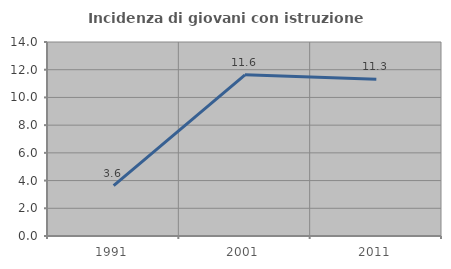
| Category | Incidenza di giovani con istruzione universitaria |
|---|---|
| 1991.0 | 3.636 |
| 2001.0 | 11.628 |
| 2011.0 | 11.321 |